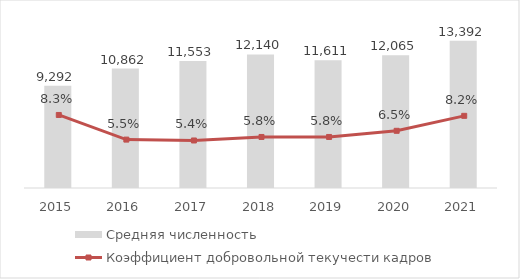
| Category | Средняя численность |
|---|---|
| 2015.0 | 9292 |
| 2016.0 | 10862 |
| 2017.0 | 11553 |
| 2018.0 | 12140 |
| 2019.0 | 11611 |
| 2020.0 | 12065 |
| 2021.0 | 13392 |